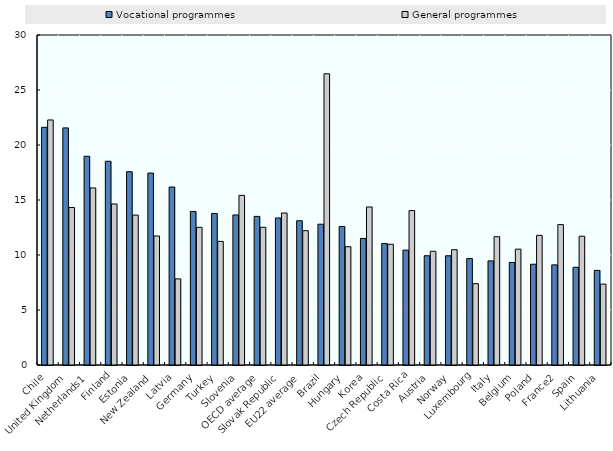
| Category | Vocational programmes | General programmes |
|---|---|---|
| Chile | 21.604 | 22.278 |
| United Kingdom | 21.554 | 14.322 |
| Netherlands1 | 18.977 | 16.097 |
| Finland | 18.525 | 14.638 |
| Estonia | 17.575 | 13.627 |
| New Zealand | 17.451 | 11.729 |
| Latvia | 16.179 | 7.828 |
| Germany | 13.96 | 12.515 |
| Turkey | 13.774 | 11.237 |
| Slovenia | 13.641 | 15.422 |
| OECD average | 13.51 | 12.518 |
| Slovak Republic | 13.367 | 13.818 |
| EU22 average | 13.115 | 12.209 |
| Brazil | 12.798 | 26.476 |
| Hungary | 12.588 | 10.755 |
| Korea | 11.504 | 14.364 |
| Czech Republic | 11.039 | 10.975 |
| Costa Rica | 10.441 | 14.04 |
| Austria | 9.932 | 10.337 |
| Norway | 9.93 | 10.482 |
| Luxembourg | 9.679 | 7.393 |
| Italy | 9.466 | 11.661 |
| Belgium | 9.319 | 10.531 |
| Poland | 9.16 | 11.785 |
| France2 | 9.101 | 12.763 |
| Spain | 8.886 | 11.708 |
| Lithuania | 8.601 | 7.353 |